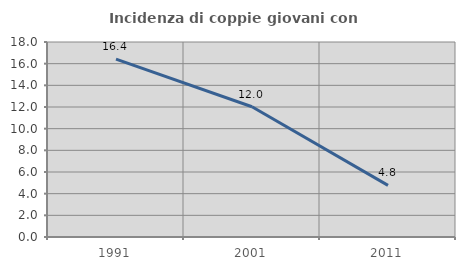
| Category | Incidenza di coppie giovani con figli |
|---|---|
| 1991.0 | 16.417 |
| 2001.0 | 12.02 |
| 2011.0 | 4.769 |